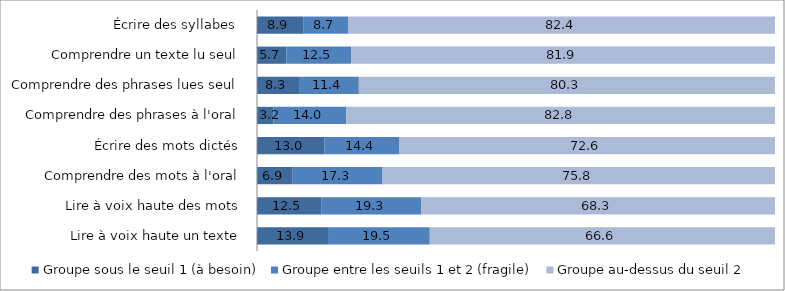
| Category | Groupe sous le seuil 1 (à besoin) | Groupe entre les seuils 1 et 2 (fragile) | Groupe au-dessus du seuil 2 |
|---|---|---|---|
| Lire à voix haute un texte | 13.87 | 19.49 | 66.64 |
| Lire à voix haute des mots | 12.49 | 19.26 | 68.25 |
| Comprendre des mots à l'oral | 6.9 | 17.32 | 75.78 |
| Écrire des mots dictés | 12.99 | 14.43 | 72.58 |
| Comprendre des phrases à l'oral | 3.17 | 14.04 | 82.79 |
| Comprendre des phrases lues seul | 8.27 | 11.39 | 80.34 |
| Comprendre un texte lu seul | 5.67 | 12.49 | 81.85 |
| Écrire des syllabes  | 8.91 | 8.66 | 82.43 |